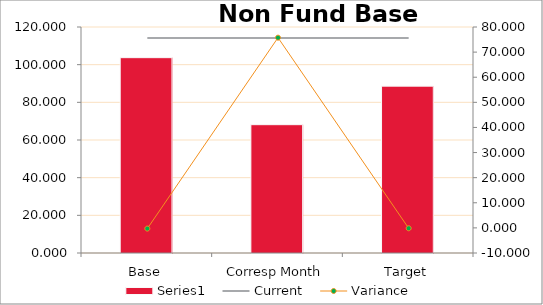
| Category | Series 0 |
|---|---|
| Base | 103.716 |
| Corresp Month | 68.133 |
| Target | 88.603 |